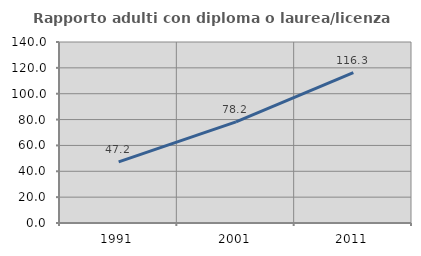
| Category | Rapporto adulti con diploma o laurea/licenza media  |
|---|---|
| 1991.0 | 47.248 |
| 2001.0 | 78.223 |
| 2011.0 | 116.265 |